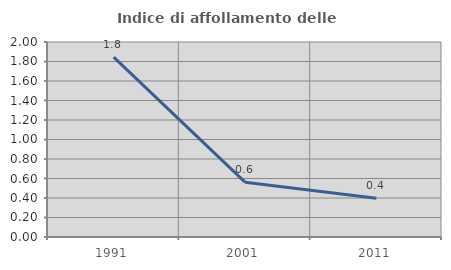
| Category | Indice di affollamento delle abitazioni  |
|---|---|
| 1991.0 | 1.844 |
| 2001.0 | 0.562 |
| 2011.0 | 0.397 |